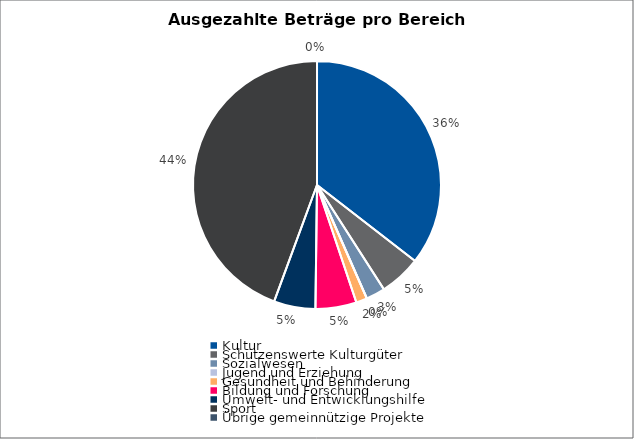
| Category | Series 0 |
|---|---|
| Kultur | 655717 |
| Schützenswerte Kulturgüter | 100254 |
| Sozialwesen | 45985 |
| Jugend und Erziehung | 0 |
| Gesundheit und Behinderung | 26576 |
| Bildung und Forschung | 98834 |
| Umwelt- und Entwicklungshilfe | 100000 |
| Sport | 819988 |
| Übrige gemeinnützige Projekte | 0 |